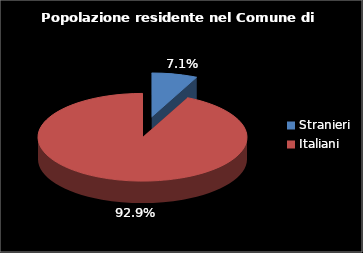
| Category | Series 0 |
|---|---|
| Stranieri | 1169 |
| Italiani | 15403 |